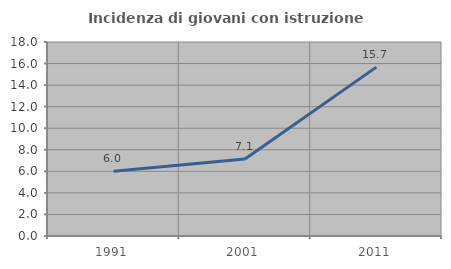
| Category | Incidenza di giovani con istruzione universitaria |
|---|---|
| 1991.0 | 6 |
| 2001.0 | 7.143 |
| 2011.0 | 15.668 |